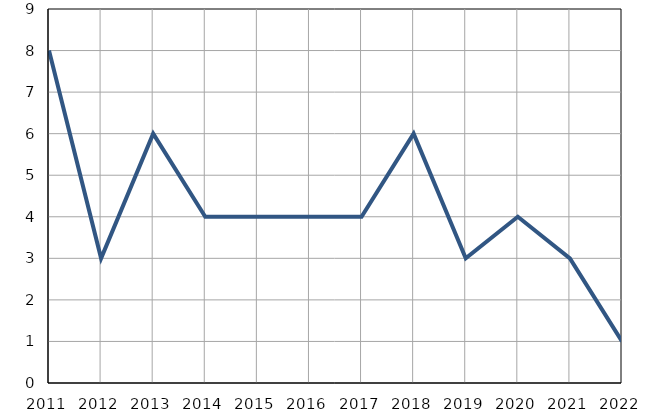
| Category | Умрла 
одојчад |
|---|---|
| 2011.0 | 8 |
| 2012.0 | 3 |
| 2013.0 | 6 |
| 2014.0 | 4 |
| 2015.0 | 4 |
| 2016.0 | 4 |
| 2017.0 | 4 |
| 2018.0 | 6 |
| 2019.0 | 3 |
| 2020.0 | 4 |
| 2021.0 | 3 |
| 2022.0 | 1 |